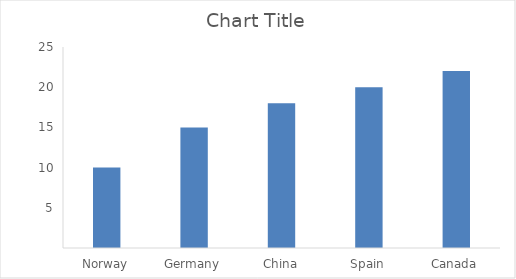
| Category | Series 0 |
|---|---|
| Norway | 10 |
| Germany | 15 |
| China | 18 |
| Spain | 20 |
| Canada | 22 |